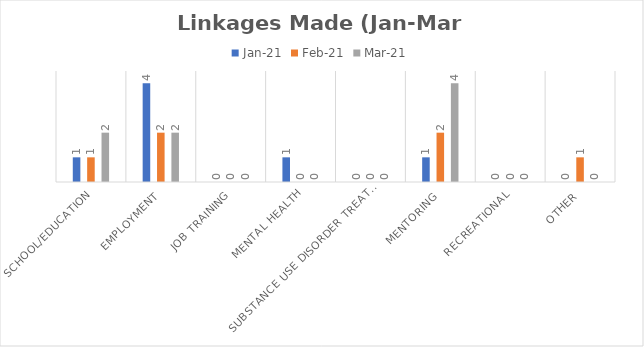
| Category | Jan-21 | Feb-21 | Mar-21 |
|---|---|---|---|
| School/education | 1 | 1 | 2 |
| Employment | 4 | 2 | 2 |
| Job Training | 0 | 0 | 0 |
| Mental Health | 1 | 0 | 0 |
| Substance Use Disorder Treatment | 0 | 0 | 0 |
| Mentoring | 1 | 2 | 4 |
| Recreational | 0 | 0 | 0 |
| Other | 0 | 1 | 0 |